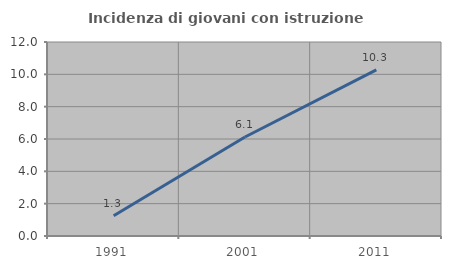
| Category | Incidenza di giovani con istruzione universitaria |
|---|---|
| 1991.0 | 1.25 |
| 2001.0 | 6.122 |
| 2011.0 | 10.28 |